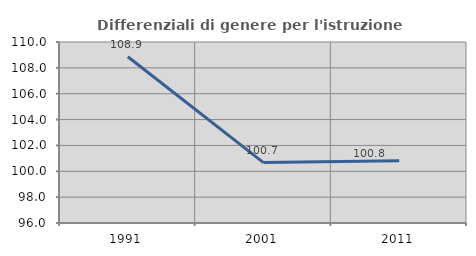
| Category | Differenziali di genere per l'istruzione superiore |
|---|---|
| 1991.0 | 108.859 |
| 2001.0 | 100.672 |
| 2011.0 | 100.811 |